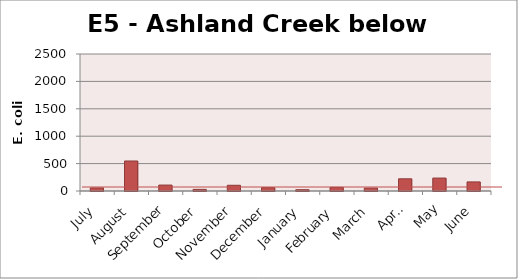
| Category | E. coli MPN |
|---|---|
| July | 56.3 |
| August | 547.5 |
| September | 108.1 |
| October | 29.9 |
| November | 104.6 |
| December | 60.1 |
| January | 23.8 |
| February | 66.3 |
| March | 53 |
| April | 222.4 |
| May | 235.9 |
| June | 165.8 |